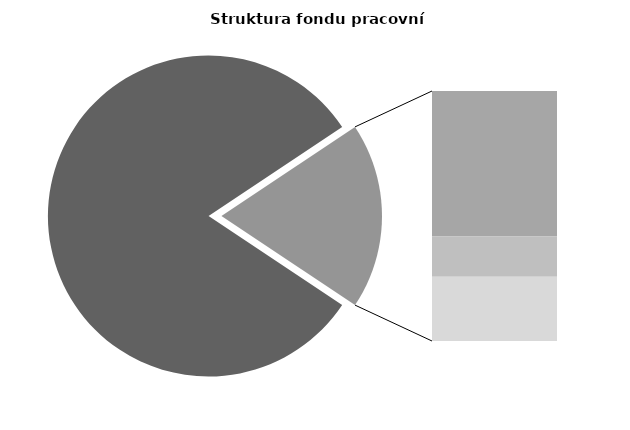
| Category | Series 0 |
|---|---|
| Průměrná měsíční odpracovaná doba bez přesčasu | 139.407 |
| Dovolená | 18.681 |
| Nemoc | 5.192 |
| Jiné | 8.243 |